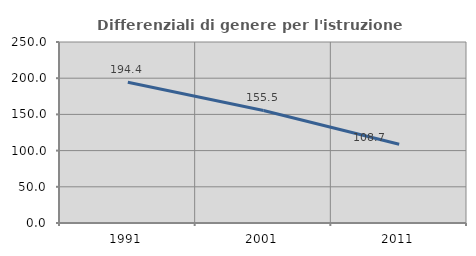
| Category | Differenziali di genere per l'istruzione superiore |
|---|---|
| 1991.0 | 194.444 |
| 2001.0 | 155.494 |
| 2011.0 | 108.699 |